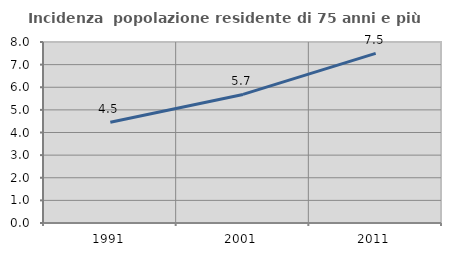
| Category | Incidenza  popolazione residente di 75 anni e più |
|---|---|
| 1991.0 | 4.455 |
| 2001.0 | 5.683 |
| 2011.0 | 7.497 |